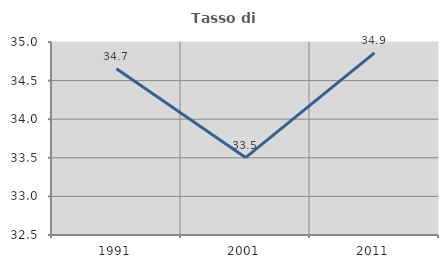
| Category | Tasso di occupazione   |
|---|---|
| 1991.0 | 34.653 |
| 2001.0 | 33.503 |
| 2011.0 | 34.86 |